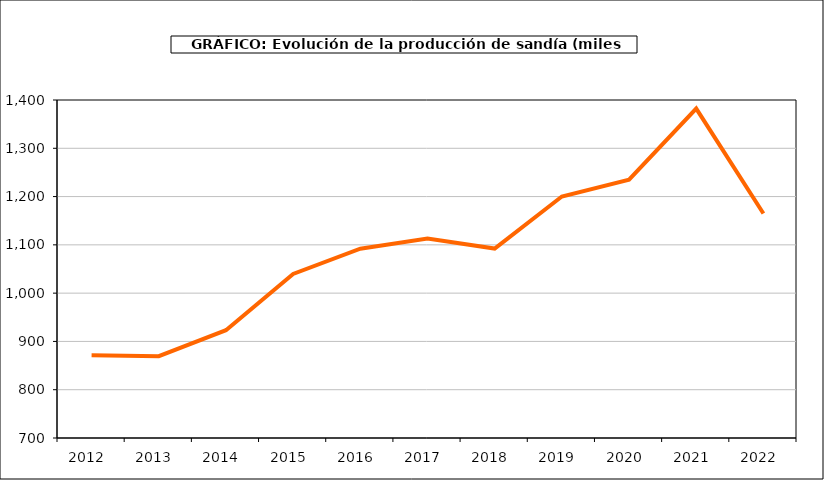
| Category | producción |
|---|---|
| 2012.0 | 871.324 |
| 2013.0 | 869.499 |
| 2014.0 | 923.32 |
| 2015.0 | 1039.698 |
| 2016.0 | 1092.075 |
| 2017.0 | 1113.192 |
| 2018.0 | 1092.401 |
| 2019.0 | 1200.093 |
| 2020.0 | 1234.85 |
| 2021.0 | 1382.278 |
| 2022.0 | 1164.989 |